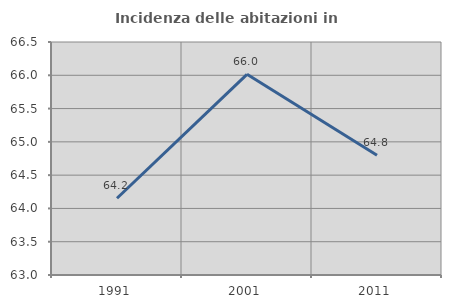
| Category | Incidenza delle abitazioni in proprietà  |
|---|---|
| 1991.0 | 64.153 |
| 2001.0 | 66.014 |
| 2011.0 | 64.799 |